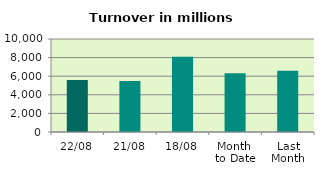
| Category | Series 0 |
|---|---|
| 22/08 | 5590.031 |
| 21/08 | 5478.216 |
| 18/08 | 8089.124 |
| Month 
to Date | 6311.718 |
| Last
Month | 6596.254 |